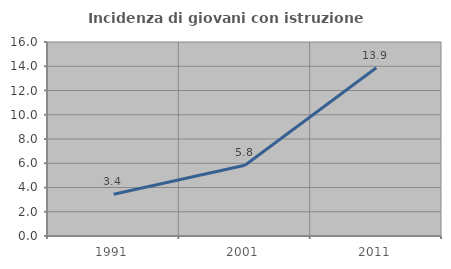
| Category | Incidenza di giovani con istruzione universitaria |
|---|---|
| 1991.0 | 3.441 |
| 2001.0 | 5.834 |
| 2011.0 | 13.876 |